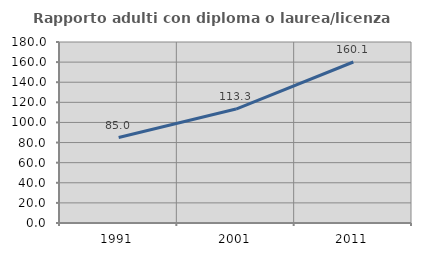
| Category | Rapporto adulti con diploma o laurea/licenza media  |
|---|---|
| 1991.0 | 84.976 |
| 2001.0 | 113.33 |
| 2011.0 | 160.126 |